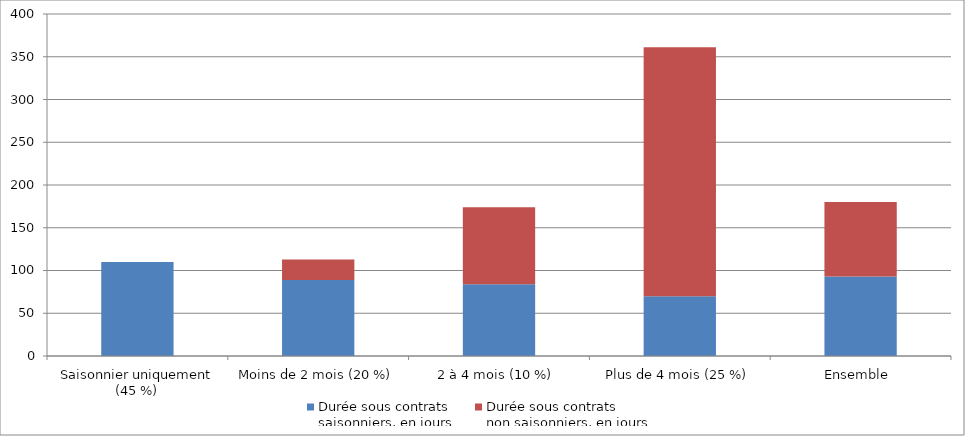
| Category | Durée sous contrats 
saisonniers, en jours | Durée sous contrats 
non saisonniers, en jours |
|---|---|---|
| Saisonnier uniquement (45 %) | 110 | 0 |
| Moins de 2 mois (20 %) | 89 | 24 |
| 2 à 4 mois (10 %) | 84 | 90 |
| Plus de 4 mois (25 %) | 70 | 291 |
| Ensemble  | 93 | 87 |